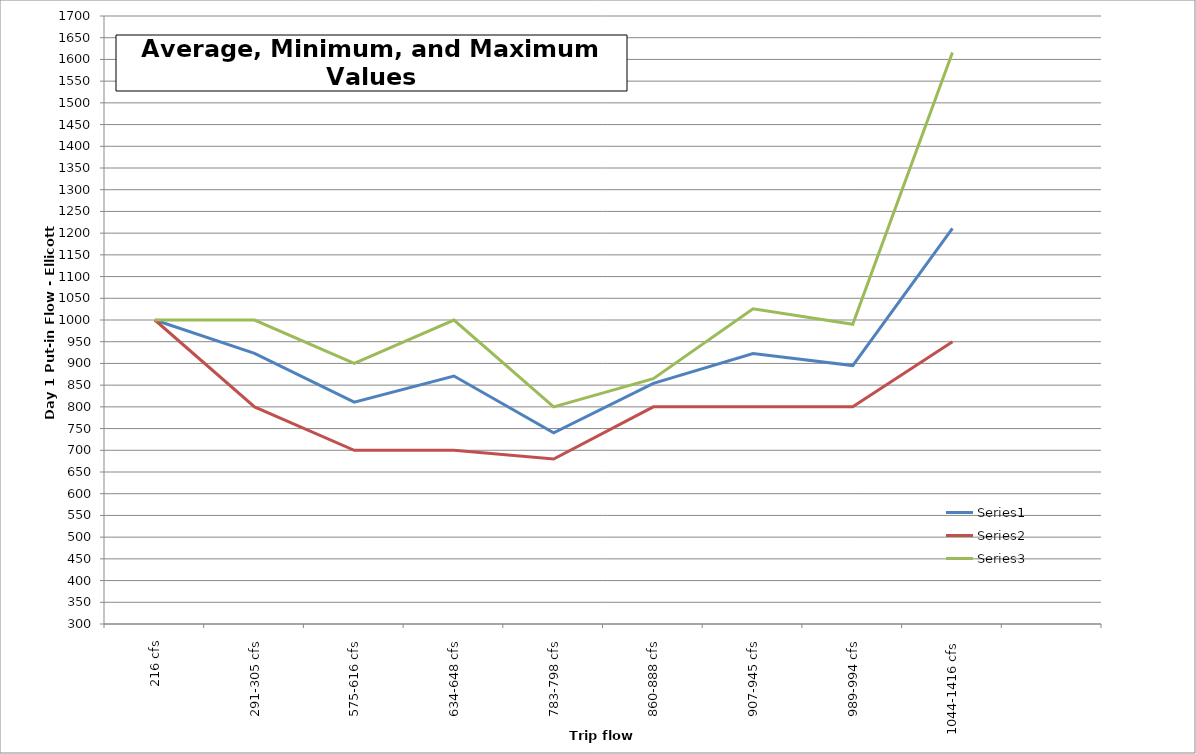
| Category | Series 0 | Series 1 | Series 2 |
|---|---|---|---|
| 216 cfs | 1000 | 1000 | 1000 |
| 291-305 cfs | 923 | 800 | 1000 |
| 575-616 cfs | 811 | 700 | 900 |
| 634-648 cfs | 871 | 700 | 1000 |
| 783-798 cfs | 740 | 680 | 800 |
| 860-888 cfs | 854 | 800 | 865 |
| 907-945 cfs | 923 | 800 | 1026 |
| 989-994 cfs | 895 | 800 | 990 |
| 1044-1416 cfs | 1211 | 950 | 1616 |